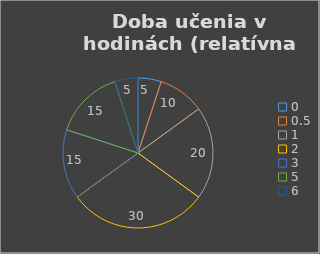
| Category | Series 0 |
|---|---|
| 0.0 | 5 |
| 0.5 | 10 |
| 1.0 | 20 |
| 2.0 | 30 |
| 3.0 | 15 |
| 5.0 | 15 |
| 6.0 | 5 |